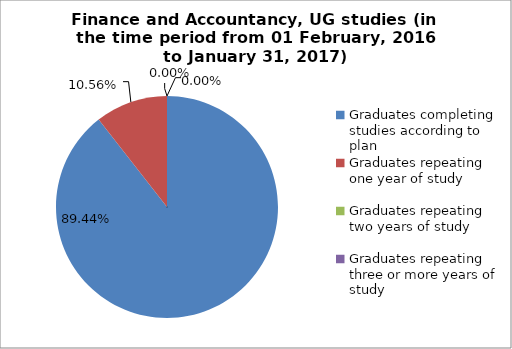
| Category | Series 0 |
|---|---|
| Graduates completing studies according to plan | 89.441 |
| Graduates repeating one year of study | 10.559 |
| Graduates repeating two years of study | 0 |
| Graduates repeating three or more years of study | 0 |